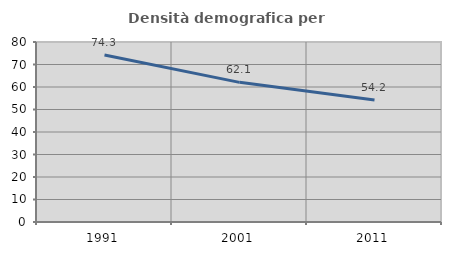
| Category | Densità demografica |
|---|---|
| 1991.0 | 74.256 |
| 2001.0 | 62.066 |
| 2011.0 | 54.245 |